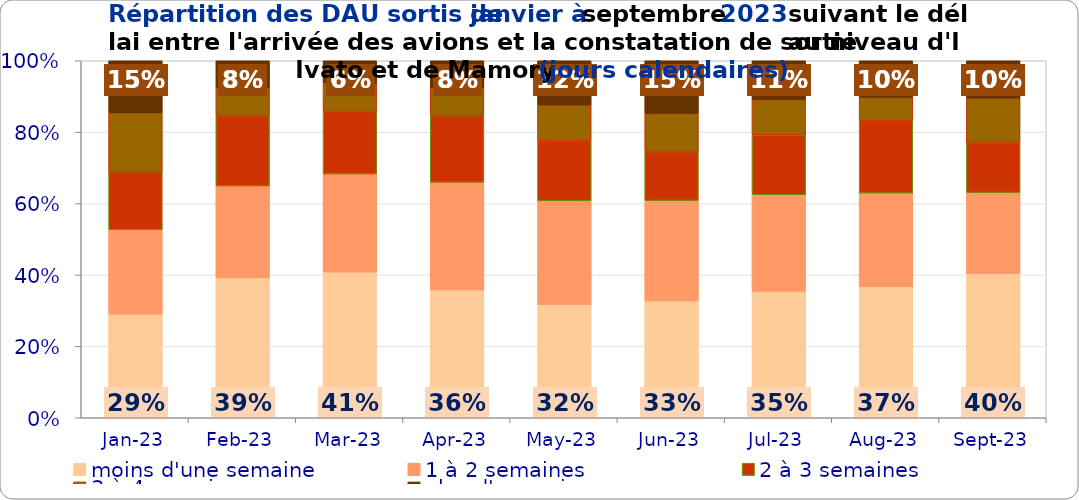
| Category | moins d'une semaine | 1 à 2 semaines | 2 à 3 semaines | 3 à 4 semaines | plus d'un mois |
|---|---|---|---|---|---|
| 2023-01-01 | 0.29 | 0.236 | 0.161 | 0.167 | 0.146 |
| 2023-02-01 | 0.392 | 0.258 | 0.197 | 0.077 | 0.076 |
| 2023-03-01 | 0.408 | 0.275 | 0.176 | 0.079 | 0.062 |
| 2023-04-01 | 0.358 | 0.302 | 0.187 | 0.078 | 0.076 |
| 2023-05-01 | 0.317 | 0.29 | 0.168 | 0.101 | 0.124 |
| 2023-06-01 | 0.327 | 0.281 | 0.137 | 0.107 | 0.147 |
| 2023-07-01 | 0.354 | 0.27 | 0.167 | 0.099 | 0.109 |
| 2023-08-01 | 0.367 | 0.262 | 0.202 | 0.066 | 0.102 |
| 2023-09-01 | 0.404 | 0.227 | 0.14 | 0.125 | 0.105 |